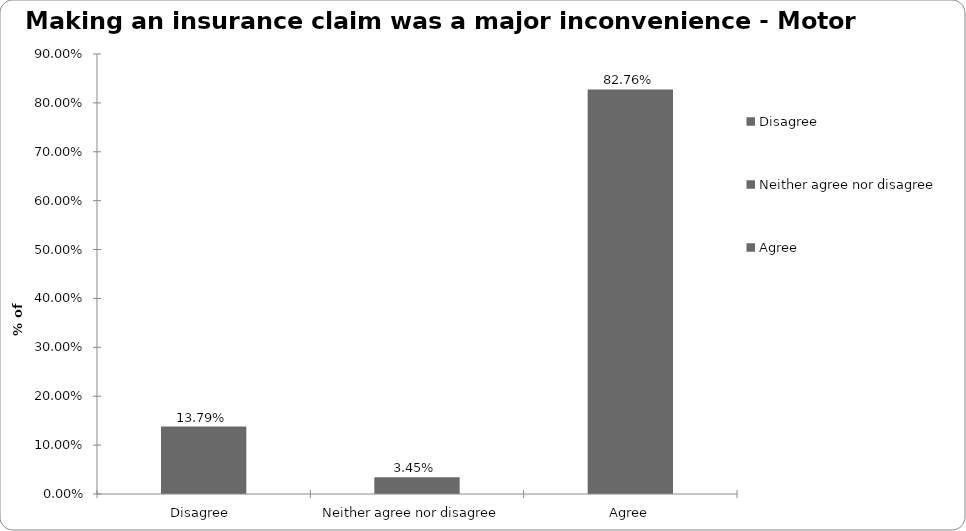
| Category | Motor |
|---|---|
| Disagree  | 0.138 |
| Neither agree nor disagree  | 0.034 |
| Agree | 0.828 |